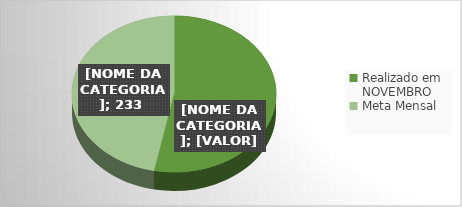
| Category | Series 0 |
|---|---|
| Realizado em NOVEMBRO | 264 |
| Meta Mensal  | 233 |